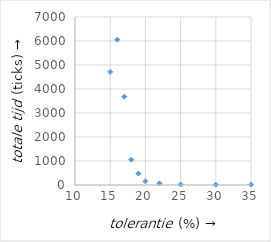
| Category | Series 0 |
|---|---|
| 35.0 | 11 |
| 30.0 | 12.667 |
| 25.0 | 21.333 |
| 22.0 | 70 |
| 20.0 | 153.333 |
| 19.0 | 476.667 |
| 18.0 | 1056.667 |
| 17.0 | 3680.667 |
| 16.0 | 6056.667 |
| 15.0 | 4713 |